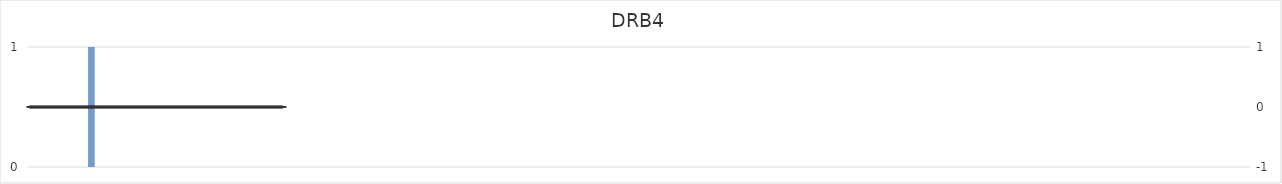
| Category | DRB4 |
|---|---|
| 1.0 | 0 |
| 2.0 | 0 |
| 3.0 | 0 |
| 4.0 | 0 |
| 5.0 | 0 |
| 6.0 | 0 |
| 7.0 | 0 |
| 8.0 | 0 |
| 9.0 | 0 |
| 10.0 | 0 |
| 11.0 | 0 |
| 12.0 | 0 |
| 13.0 | 0 |
| 14.0 | 0 |
| 15.0 | 0 |
| 16.0 | 0 |
| 17.0 | 0 |
| 18.0 | 0 |
| 19.0 | 0 |
| 20.0 | 0 |
| 21.0 | 0 |
| 22.0 | 0 |
| 23.0 | 0 |
| 24.0 | 0 |
| 25.0 | 0 |
| 26.0 | 0 |
| 27.0 | 0 |
| 28.0 | 0 |
| 29.0 | 0 |
| 30.0 | 0 |
| 31.0 | 0 |
| 32.0 | 0 |
| 33.0 | 0 |
| 34.0 | 0 |
| 35.0 | 0 |
| 36.0 | 0 |
| 37.0 | 0 |
| 38.0 | 0 |
| 39.0 | 0 |
| 40.0 | 0 |
| 41.0 | 0 |
| 42.0 | 0 |
| 43.0 | 0 |
| 44.0 | 0 |
| 45.0 | 0 |
| 46.0 | 0 |
| 47.0 | 0 |
| 48.0 | 0 |
| 49.0 | 0 |
| 50.0 | 0 |
| 51.0 | 0 |
| 52.0 | 0 |
| 53.0 | 0 |
| 54.0 | 0 |
| 55.0 | 0 |
| 56.0 | 0 |
| 57.0 | 0 |
| 58.0 | 0 |
| 59.0 | 0 |
| 60.0 | 0 |
| 61.0 | 0 |
| 62.0 | 0 |
| 63.0 | 0 |
| 64.0 | 0 |
| 65.0 | 0 |
| 66.0 | 0 |
| 67.0 | 0 |
| 68.0 | 0 |
| 69.0 | 0 |
| 70.0 | 0 |
| 71.0 | 0 |
| 72.0 | 0 |
| 73.0 | 0 |
| 74.0 | 0 |
| 75.0 | 0 |
| 76.0 | 0 |
| 77.0 | 0 |
| 78.0 | 0 |
| 79.0 | 0 |
| 80.0 | 0 |
| 81.0 | 0 |
| 82.0 | 0 |
| 83.0 | 0 |
| 84.0 | 0 |
| 85.0 | 1 |
| 86.0 | 1 |
| 87.0 | 1 |
| 88.0 | 1 |
| 89.0 | 1 |
| 90.0 | 1 |
| 91.0 | 1 |
| 92.0 | 1 |
| 93.0 | 1 |
| 94.0 | 0 |
| 95.0 | 0 |
| 96.0 | 0 |
| 97.0 | 0 |
| 98.0 | 0 |
| 99.0 | 0 |
| 100.0 | 0 |
| 101.0 | 0 |
| 102.0 | 0 |
| 103.0 | 0 |
| 104.0 | 0 |
| 105.0 | 0 |
| 106.0 | 0 |
| 107.0 | 0 |
| 108.0 | 0 |
| 109.0 | 0 |
| 110.0 | 0 |
| 111.0 | 0 |
| 112.0 | 0 |
| 113.0 | 0 |
| 114.0 | 0 |
| 115.0 | 0 |
| 116.0 | 0 |
| 117.0 | 0 |
| 118.0 | 0 |
| 119.0 | 0 |
| 120.0 | 0 |
| 121.0 | 0 |
| 122.0 | 0 |
| 123.0 | 0 |
| 124.0 | 0 |
| 125.0 | 0 |
| 126.0 | 0 |
| 127.0 | 0 |
| 128.0 | 0 |
| 129.0 | 0 |
| 130.0 | 0 |
| 131.0 | 0 |
| 132.0 | 0 |
| 133.0 | 0 |
| 134.0 | 0 |
| 135.0 | 0 |
| 136.0 | 0 |
| 137.0 | 0 |
| 138.0 | 0 |
| 139.0 | 0 |
| 140.0 | 0 |
| 141.0 | 0 |
| 142.0 | 0 |
| 143.0 | 0 |
| 144.0 | 0 |
| 145.0 | 0 |
| 146.0 | 0 |
| 147.0 | 0 |
| 148.0 | 0 |
| 149.0 | 0 |
| 150.0 | 0 |
| 151.0 | 0 |
| 152.0 | 0 |
| 153.0 | 0 |
| 154.0 | 0 |
| 155.0 | 0 |
| 156.0 | 0 |
| 157.0 | 0 |
| 158.0 | 0 |
| 159.0 | 0 |
| 160.0 | 0 |
| 161.0 | 0 |
| 162.0 | 0 |
| 163.0 | 0 |
| 164.0 | 0 |
| 165.0 | 0 |
| 166.0 | 0 |
| 167.0 | 0 |
| 168.0 | 0 |
| 169.0 | 0 |
| 170.0 | 0 |
| 171.0 | 0 |
| 172.0 | 0 |
| 173.0 | 0 |
| 174.0 | 0 |
| 175.0 | 0 |
| 176.0 | 0 |
| 177.0 | 0 |
| 178.0 | 0 |
| 179.0 | 0 |
| 180.0 | 0 |
| 181.0 | 0 |
| 182.0 | 0 |
| 183.0 | 0 |
| 184.0 | 0 |
| 185.0 | 0 |
| 186.0 | 0 |
| 187.0 | 0 |
| 188.0 | 0 |
| 189.0 | 0 |
| 190.0 | 0 |
| 191.0 | 0 |
| 192.0 | 0 |
| 193.0 | 0 |
| 194.0 | 0 |
| 195.0 | 0 |
| 196.0 | 0 |
| 197.0 | 0 |
| 198.0 | 0 |
| 199.0 | 0 |
| 200.0 | 0 |
| 201.0 | 0 |
| 202.0 | 0 |
| 203.0 | 0 |
| 204.0 | 0 |
| 205.0 | 0 |
| 206.0 | 0 |
| 207.0 | 0 |
| 208.0 | 0 |
| 209.0 | 0 |
| 210.0 | 0 |
| 211.0 | 0 |
| 212.0 | 0 |
| 213.0 | 0 |
| 214.0 | 0 |
| 215.0 | 0 |
| 216.0 | 0 |
| 217.0 | 0 |
| 218.0 | 0 |
| 219.0 | 0 |
| 220.0 | 0 |
| 221.0 | 0 |
| 222.0 | 0 |
| 223.0 | 0 |
| 224.0 | 0 |
| 225.0 | 0 |
| 226.0 | 0 |
| 227.0 | 0 |
| 228.0 | 0 |
| 229.0 | 0 |
| 230.0 | 0 |
| 231.0 | 0 |
| 232.0 | 0 |
| 233.0 | 0 |
| 234.0 | 0 |
| 235.0 | 0 |
| 236.0 | 0 |
| 237.0 | 0 |
| 238.0 | 0 |
| 239.0 | 0 |
| 240.0 | 0 |
| 241.0 | 0 |
| 242.0 | 0 |
| 243.0 | 0 |
| 244.0 | 0 |
| 245.0 | 0 |
| 246.0 | 0 |
| 247.0 | 0 |
| 248.0 | 0 |
| 249.0 | 0 |
| 250.0 | 0 |
| 251.0 | 0 |
| 252.0 | 0 |
| 253.0 | 0 |
| 254.0 | 0 |
| 255.0 | 0 |
| 256.0 | 0 |
| 257.0 | 0 |
| 258.0 | 0 |
| 259.0 | 0 |
| 260.0 | 0 |
| 261.0 | 0 |
| 262.0 | 0 |
| 263.0 | 0 |
| 264.0 | 0 |
| 265.0 | 0 |
| 266.0 | 0 |
| 267.0 | 0 |
| 268.0 | 0 |
| 269.0 | 0 |
| 270.0 | 0 |
| 271.0 | 0 |
| 272.0 | 0 |
| 273.0 | 0 |
| 274.0 | 0 |
| 275.0 | 0 |
| 276.0 | 0 |
| 277.0 | 0 |
| 278.0 | 0 |
| 279.0 | 0 |
| 280.0 | 0 |
| 281.0 | 0 |
| 282.0 | 0 |
| 283.0 | 0 |
| 284.0 | 0 |
| 285.0 | 0 |
| 286.0 | 0 |
| 287.0 | 0 |
| 288.0 | 0 |
| 289.0 | 0 |
| 290.0 | 0 |
| 291.0 | 0 |
| 292.0 | 0 |
| 293.0 | 0 |
| 294.0 | 0 |
| 295.0 | 0 |
| 296.0 | 0 |
| 297.0 | 0 |
| 298.0 | 0 |
| 299.0 | 0 |
| 300.0 | 0 |
| 301.0 | 0 |
| 302.0 | 0 |
| 303.0 | 0 |
| 304.0 | 0 |
| 305.0 | 0 |
| 306.0 | 0 |
| 307.0 | 0 |
| 308.0 | 0 |
| 309.0 | 0 |
| 310.0 | 0 |
| 311.0 | 0 |
| 312.0 | 0 |
| 313.0 | 0 |
| 314.0 | 0 |
| 315.0 | 0 |
| 316.0 | 0 |
| 317.0 | 0 |
| 318.0 | 0 |
| 319.0 | 0 |
| 320.0 | 0 |
| 321.0 | 0 |
| 322.0 | 0 |
| 323.0 | 0 |
| 324.0 | 0 |
| 325.0 | 0 |
| 326.0 | 0 |
| 327.0 | 0 |
| 328.0 | 0 |
| 329.0 | 0 |
| 330.0 | 0 |
| 331.0 | 0 |
| 332.0 | 0 |
| 333.0 | 0 |
| 334.0 | 0 |
| 335.0 | 0 |
| 336.0 | 0 |
| 337.0 | 0 |
| 338.0 | 0 |
| 339.0 | 0 |
| 340.0 | 0 |
| 341.0 | 0 |
| 342.0 | 0 |
| 343.0 | 0 |
| 344.0 | 0 |
| 345.0 | 0 |
| 346.0 | 0 |
| 347.0 | 0 |
| 348.0 | 0 |
| 349.0 | 0 |
| 350.0 | 0 |
| 351.0 | 0 |
| 352.0 | 0 |
| 353.0 | 0 |
| 354.0 | 0 |
| 355.0 | 0 |
| 356.0 | 0 |
| 357.0 | 0 |
| 358.0 | 0 |
| 359.0 | 0 |
| 360.0 | 0 |
| 361.0 | 0 |
| 362.0 | 0 |
| 363.0 | 0 |
| 364.0 | 0 |
| 365.0 | 0 |
| 366.0 | 0 |
| 367.0 | 0 |
| 368.0 | 0 |
| 369.0 | 0 |
| 370.0 | 0 |
| 371.0 | 0 |
| 372.0 | 0 |
| 373.0 | 0 |
| 374.0 | 0 |
| 375.0 | 0 |
| 376.0 | 0 |
| 377.0 | 0 |
| 378.0 | 0 |
| 379.0 | 0 |
| 380.0 | 0 |
| 381.0 | 0 |
| 382.0 | 0 |
| 383.0 | 0 |
| 384.0 | 0 |
| 385.0 | 0 |
| 386.0 | 0 |
| 387.0 | 0 |
| 388.0 | 0 |
| 389.0 | 0 |
| 390.0 | 0 |
| 391.0 | 0 |
| 392.0 | 0 |
| 393.0 | 0 |
| 394.0 | 0 |
| 395.0 | 0 |
| 396.0 | 0 |
| 397.0 | 0 |
| 398.0 | 0 |
| 399.0 | 0 |
| 400.0 | 0 |
| 401.0 | 0 |
| 402.0 | 0 |
| 403.0 | 0 |
| 404.0 | 0 |
| 405.0 | 0 |
| 406.0 | 0 |
| 407.0 | 0 |
| 408.0 | 0 |
| 409.0 | 0 |
| 410.0 | 0 |
| 411.0 | 0 |
| 412.0 | 0 |
| 413.0 | 0 |
| 414.0 | 0 |
| 415.0 | 0 |
| 416.0 | 0 |
| 417.0 | 0 |
| 418.0 | 0 |
| 419.0 | 0 |
| 420.0 | 0 |
| 421.0 | 0 |
| 422.0 | 0 |
| 423.0 | 0 |
| 424.0 | 0 |
| 425.0 | 0 |
| 426.0 | 0 |
| 427.0 | 0 |
| 428.0 | 0 |
| 429.0 | 0 |
| 430.0 | 0 |
| 431.0 | 0 |
| 432.0 | 0 |
| 433.0 | 0 |
| 434.0 | 0 |
| 435.0 | 0 |
| 436.0 | 0 |
| 437.0 | 0 |
| 438.0 | 0 |
| 439.0 | 0 |
| 440.0 | 0 |
| 441.0 | 0 |
| 442.0 | 0 |
| 443.0 | 0 |
| 444.0 | 0 |
| 445.0 | 0 |
| 446.0 | 0 |
| 447.0 | 0 |
| 448.0 | 0 |
| 449.0 | 0 |
| 450.0 | 0 |
| 451.0 | 0 |
| 452.0 | 0 |
| 453.0 | 0 |
| 454.0 | 0 |
| 455.0 | 0 |
| 456.0 | 0 |
| 457.0 | 0 |
| 458.0 | 0 |
| 459.0 | 0 |
| 460.0 | 0 |
| 461.0 | 0 |
| 462.0 | 0 |
| 463.0 | 0 |
| 464.0 | 0 |
| 465.0 | 0 |
| 466.0 | 0 |
| 467.0 | 0 |
| 468.0 | 0 |
| 469.0 | 0 |
| 470.0 | 0 |
| 471.0 | 0 |
| 472.0 | 0 |
| 473.0 | 0 |
| 474.0 | 0 |
| 475.0 | 0 |
| 476.0 | 0 |
| 477.0 | 0 |
| 478.0 | 0 |
| 479.0 | 0 |
| 480.0 | 0 |
| 481.0 | 0 |
| 482.0 | 0 |
| 483.0 | 0 |
| 484.0 | 0 |
| 485.0 | 0 |
| 486.0 | 0 |
| 487.0 | 0 |
| 488.0 | 0 |
| 489.0 | 0 |
| 490.0 | 0 |
| 491.0 | 0 |
| 492.0 | 0 |
| 493.0 | 0 |
| 494.0 | 0 |
| 495.0 | 0 |
| 496.0 | 0 |
| 497.0 | 0 |
| 498.0 | 0 |
| 499.0 | 0 |
| 500.0 | 0 |
| 501.0 | 0 |
| 502.0 | 0 |
| 503.0 | 0 |
| 504.0 | 0 |
| 505.0 | 0 |
| 506.0 | 0 |
| 507.0 | 0 |
| 508.0 | 0 |
| 509.0 | 0 |
| 510.0 | 0 |
| 511.0 | 0 |
| 512.0 | 0 |
| 513.0 | 0 |
| 514.0 | 0 |
| 515.0 | 0 |
| 516.0 | 0 |
| 517.0 | 0 |
| 518.0 | 0 |
| 519.0 | 0 |
| 520.0 | 0 |
| 521.0 | 0 |
| 522.0 | 0 |
| 523.0 | 0 |
| 524.0 | 0 |
| 525.0 | 0 |
| 526.0 | 0 |
| 527.0 | 0 |
| 528.0 | 0 |
| 529.0 | 0 |
| 530.0 | 0 |
| 531.0 | 0 |
| 532.0 | 0 |
| 533.0 | 0 |
| 534.0 | 0 |
| 535.0 | 0 |
| 536.0 | 0 |
| 537.0 | 0 |
| 538.0 | 0 |
| 539.0 | 0 |
| 540.0 | 0 |
| 541.0 | 0 |
| 542.0 | 0 |
| 543.0 | 0 |
| 544.0 | 0 |
| 545.0 | 0 |
| 546.0 | 0 |
| 547.0 | 0 |
| 548.0 | 0 |
| 549.0 | 0 |
| 550.0 | 0 |
| 551.0 | 0 |
| 552.0 | 0 |
| 553.0 | 0 |
| 554.0 | 0 |
| 555.0 | 0 |
| 556.0 | 0 |
| 557.0 | 0 |
| 558.0 | 0 |
| 559.0 | 0 |
| 560.0 | 0 |
| 561.0 | 0 |
| 562.0 | 0 |
| 563.0 | 0 |
| 564.0 | 0 |
| 565.0 | 0 |
| 566.0 | 0 |
| 567.0 | 0 |
| 568.0 | 0 |
| 569.0 | 0 |
| 570.0 | 0 |
| 571.0 | 0 |
| 572.0 | 0 |
| 573.0 | 0 |
| 574.0 | 0 |
| 575.0 | 0 |
| 576.0 | 0 |
| 577.0 | 0 |
| 578.0 | 0 |
| 579.0 | 0 |
| 580.0 | 0 |
| 581.0 | 0 |
| 582.0 | 0 |
| 583.0 | 0 |
| 584.0 | 0 |
| 585.0 | 0 |
| 586.0 | 0 |
| 587.0 | 0 |
| 588.0 | 0 |
| 589.0 | 0 |
| 590.0 | 0 |
| 591.0 | 0 |
| 592.0 | 0 |
| 593.0 | 0 |
| 594.0 | 0 |
| 595.0 | 0 |
| 596.0 | 0 |
| 597.0 | 0 |
| 598.0 | 0 |
| 599.0 | 0 |
| 600.0 | 0 |
| 601.0 | 0 |
| 602.0 | 0 |
| 603.0 | 0 |
| 604.0 | 0 |
| 605.0 | 0 |
| 606.0 | 0 |
| 607.0 | 0 |
| 608.0 | 0 |
| 609.0 | 0 |
| 610.0 | 0 |
| 611.0 | 0 |
| 612.0 | 0 |
| 613.0 | 0 |
| 614.0 | 0 |
| 615.0 | 0 |
| 616.0 | 0 |
| 617.0 | 0 |
| 618.0 | 0 |
| 619.0 | 0 |
| 620.0 | 0 |
| 621.0 | 0 |
| 622.0 | 0 |
| 623.0 | 0 |
| 624.0 | 0 |
| 625.0 | 0 |
| 626.0 | 0 |
| 627.0 | 0 |
| 628.0 | 0 |
| 629.0 | 0 |
| 630.0 | 0 |
| 631.0 | 0 |
| 632.0 | 0 |
| 633.0 | 0 |
| 634.0 | 0 |
| 635.0 | 0 |
| 636.0 | 0 |
| 637.0 | 0 |
| 638.0 | 0 |
| 639.0 | 0 |
| 640.0 | 0 |
| 641.0 | 0 |
| 642.0 | 0 |
| 643.0 | 0 |
| 644.0 | 0 |
| 645.0 | 0 |
| 646.0 | 0 |
| 647.0 | 0 |
| 648.0 | 0 |
| 649.0 | 0 |
| 650.0 | 0 |
| 651.0 | 0 |
| 652.0 | 0 |
| 653.0 | 0 |
| 654.0 | 0 |
| 655.0 | 0 |
| 656.0 | 0 |
| 657.0 | 0 |
| 658.0 | 0 |
| 659.0 | 0 |
| 660.0 | 0 |
| 661.0 | 0 |
| 662.0 | 0 |
| 663.0 | 0 |
| 664.0 | 0 |
| 665.0 | 0 |
| 666.0 | 0 |
| 667.0 | 0 |
| 668.0 | 0 |
| 669.0 | 0 |
| 670.0 | 0 |
| 671.0 | 0 |
| 672.0 | 0 |
| 673.0 | 0 |
| 674.0 | 0 |
| 675.0 | 0 |
| 676.0 | 0 |
| 677.0 | 0 |
| 678.0 | 0 |
| 679.0 | 0 |
| 680.0 | 0 |
| 681.0 | 0 |
| 682.0 | 0 |
| 683.0 | 0 |
| 684.0 | 0 |
| 685.0 | 0 |
| 686.0 | 0 |
| 687.0 | 0 |
| 688.0 | 0 |
| 689.0 | 0 |
| 690.0 | 0 |
| 691.0 | 0 |
| 692.0 | 0 |
| 693.0 | 0 |
| 694.0 | 0 |
| 695.0 | 0 |
| 696.0 | 0 |
| 697.0 | 0 |
| 698.0 | 0 |
| 699.0 | 0 |
| 700.0 | 0 |
| 701.0 | 0 |
| 702.0 | 0 |
| 703.0 | 0 |
| 704.0 | 0 |
| 705.0 | 0 |
| 706.0 | 0 |
| 707.0 | 0 |
| 708.0 | 0 |
| 709.0 | 0 |
| 710.0 | 0 |
| 711.0 | 0 |
| 712.0 | 0 |
| 713.0 | 0 |
| 714.0 | 0 |
| 715.0 | 0 |
| 716.0 | 0 |
| 717.0 | 0 |
| 718.0 | 0 |
| 719.0 | 0 |
| 720.0 | 0 |
| 721.0 | 0 |
| 722.0 | 0 |
| 723.0 | 0 |
| 724.0 | 0 |
| 725.0 | 0 |
| 726.0 | 0 |
| 727.0 | 0 |
| 728.0 | 0 |
| 729.0 | 0 |
| 730.0 | 0 |
| 731.0 | 0 |
| 732.0 | 0 |
| 733.0 | 0 |
| 734.0 | 0 |
| 735.0 | 0 |
| 736.0 | 0 |
| 737.0 | 0 |
| 738.0 | 0 |
| 739.0 | 0 |
| 740.0 | 0 |
| 741.0 | 0 |
| 742.0 | 0 |
| 743.0 | 0 |
| 744.0 | 0 |
| 745.0 | 0 |
| 746.0 | 0 |
| 747.0 | 0 |
| 748.0 | 0 |
| 749.0 | 0 |
| 750.0 | 0 |
| 751.0 | 0 |
| 752.0 | 0 |
| 753.0 | 0 |
| 754.0 | 0 |
| 755.0 | 0 |
| 756.0 | 0 |
| 757.0 | 0 |
| 758.0 | 0 |
| 759.0 | 0 |
| 760.0 | 0 |
| 761.0 | 0 |
| 762.0 | 0 |
| 763.0 | 0 |
| 764.0 | 0 |
| 765.0 | 0 |
| 766.0 | 0 |
| 767.0 | 0 |
| 768.0 | 0 |
| 769.0 | 0 |
| 770.0 | 0 |
| 771.0 | 0 |
| 772.0 | 0 |
| 773.0 | 0 |
| 774.0 | 0 |
| 775.0 | 0 |
| 776.0 | 0 |
| 777.0 | 0 |
| 778.0 | 0 |
| 779.0 | 0 |
| 780.0 | 0 |
| 781.0 | 0 |
| 782.0 | 0 |
| 783.0 | 0 |
| 784.0 | 0 |
| 785.0 | 0 |
| 786.0 | 0 |
| 787.0 | 0 |
| 788.0 | 0 |
| 789.0 | 0 |
| 790.0 | 0 |
| 791.0 | 0 |
| 792.0 | 0 |
| 793.0 | 0 |
| 794.0 | 0 |
| 795.0 | 0 |
| 796.0 | 0 |
| 797.0 | 0 |
| 798.0 | 0 |
| 799.0 | 0 |
| 800.0 | 0 |
| 801.0 | 0 |
| 802.0 | 0 |
| 803.0 | 0 |
| 804.0 | 0 |
| 805.0 | 0 |
| 806.0 | 0 |
| 807.0 | 0 |
| 808.0 | 0 |
| 809.0 | 0 |
| 810.0 | 0 |
| 811.0 | 0 |
| 812.0 | 0 |
| 813.0 | 0 |
| 814.0 | 0 |
| 815.0 | 0 |
| 816.0 | 0 |
| 817.0 | 0 |
| 818.0 | 0 |
| 819.0 | 0 |
| 820.0 | 0 |
| 821.0 | 0 |
| 822.0 | 0 |
| 823.0 | 0 |
| 824.0 | 0 |
| 825.0 | 0 |
| 826.0 | 0 |
| 827.0 | 0 |
| 828.0 | 0 |
| 829.0 | 0 |
| 830.0 | 0 |
| 831.0 | 0 |
| 832.0 | 0 |
| 833.0 | 0 |
| 834.0 | 0 |
| 835.0 | 0 |
| 836.0 | 0 |
| 837.0 | 0 |
| 838.0 | 0 |
| 839.0 | 0 |
| 840.0 | 0 |
| 841.0 | 0 |
| 842.0 | 0 |
| 843.0 | 0 |
| 844.0 | 0 |
| 845.0 | 0 |
| 846.0 | 0 |
| 847.0 | 0 |
| 848.0 | 0 |
| 849.0 | 0 |
| 850.0 | 0 |
| 851.0 | 0 |
| 852.0 | 0 |
| 853.0 | 0 |
| 854.0 | 0 |
| 855.0 | 0 |
| 856.0 | 0 |
| 857.0 | 0 |
| 858.0 | 0 |
| 859.0 | 0 |
| 860.0 | 0 |
| 861.0 | 0 |
| 862.0 | 0 |
| 863.0 | 0 |
| 864.0 | 0 |
| 865.0 | 0 |
| 866.0 | 0 |
| 867.0 | 0 |
| 868.0 | 0 |
| 869.0 | 0 |
| 870.0 | 0 |
| 871.0 | 0 |
| 872.0 | 0 |
| 873.0 | 0 |
| 874.0 | 0 |
| 875.0 | 0 |
| 876.0 | 0 |
| 877.0 | 0 |
| 878.0 | 0 |
| 879.0 | 0 |
| 880.0 | 0 |
| 881.0 | 0 |
| 882.0 | 0 |
| 883.0 | 0 |
| 884.0 | 0 |
| 885.0 | 0 |
| 886.0 | 0 |
| 887.0 | 0 |
| 888.0 | 0 |
| 889.0 | 0 |
| 890.0 | 0 |
| 891.0 | 0 |
| 892.0 | 0 |
| 893.0 | 0 |
| 894.0 | 0 |
| 895.0 | 0 |
| 896.0 | 0 |
| 897.0 | 0 |
| 898.0 | 0 |
| 899.0 | 0 |
| 900.0 | 0 |
| 901.0 | 0 |
| 902.0 | 0 |
| 903.0 | 0 |
| 904.0 | 0 |
| 905.0 | 0 |
| 906.0 | 0 |
| 907.0 | 0 |
| 908.0 | 0 |
| 909.0 | 0 |
| 910.0 | 0 |
| 911.0 | 0 |
| 912.0 | 0 |
| 913.0 | 0 |
| 914.0 | 0 |
| 915.0 | 0 |
| 916.0 | 0 |
| 917.0 | 0 |
| 918.0 | 0 |
| 919.0 | 0 |
| 920.0 | 0 |
| 921.0 | 0 |
| 922.0 | 0 |
| 923.0 | 0 |
| 924.0 | 0 |
| 925.0 | 0 |
| 926.0 | 0 |
| 927.0 | 0 |
| 928.0 | 0 |
| 929.0 | 0 |
| 930.0 | 0 |
| 931.0 | 0 |
| 932.0 | 0 |
| 933.0 | 0 |
| 934.0 | 0 |
| 935.0 | 0 |
| 936.0 | 0 |
| 937.0 | 0 |
| 938.0 | 0 |
| 939.0 | 0 |
| 940.0 | 0 |
| 941.0 | 0 |
| 942.0 | 0 |
| 943.0 | 0 |
| 944.0 | 0 |
| 945.0 | 0 |
| 946.0 | 0 |
| 947.0 | 0 |
| 948.0 | 0 |
| 949.0 | 0 |
| 950.0 | 0 |
| 951.0 | 0 |
| 952.0 | 0 |
| 953.0 | 0 |
| 954.0 | 0 |
| 955.0 | 0 |
| 956.0 | 0 |
| 957.0 | 0 |
| 958.0 | 0 |
| 959.0 | 0 |
| 960.0 | 0 |
| 961.0 | 0 |
| 962.0 | 0 |
| 963.0 | 0 |
| 964.0 | 0 |
| 965.0 | 0 |
| 966.0 | 0 |
| 967.0 | 0 |
| 968.0 | 0 |
| 969.0 | 0 |
| 970.0 | 0 |
| 971.0 | 0 |
| 972.0 | 0 |
| 973.0 | 0 |
| 974.0 | 0 |
| 975.0 | 0 |
| 976.0 | 0 |
| 977.0 | 0 |
| 978.0 | 0 |
| 979.0 | 0 |
| 980.0 | 0 |
| 981.0 | 0 |
| 982.0 | 0 |
| 983.0 | 0 |
| 984.0 | 0 |
| 985.0 | 0 |
| 986.0 | 0 |
| 987.0 | 0 |
| 988.0 | 0 |
| 989.0 | 0 |
| 990.0 | 0 |
| 991.0 | 0 |
| 992.0 | 0 |
| 993.0 | 0 |
| 994.0 | 0 |
| 995.0 | 0 |
| 996.0 | 0 |
| 997.0 | 0 |
| 998.0 | 0 |
| 999.0 | 0 |
| 1000.0 | 0 |
| 1001.0 | 0 |
| 1002.0 | 0 |
| 1003.0 | 0 |
| 1004.0 | 0 |
| 1005.0 | 0 |
| 1006.0 | 0 |
| 1007.0 | 0 |
| 1008.0 | 0 |
| 1009.0 | 0 |
| 1010.0 | 0 |
| 1011.0 | 0 |
| 1012.0 | 0 |
| 1013.0 | 0 |
| 1014.0 | 0 |
| 1015.0 | 0 |
| 1016.0 | 0 |
| 1017.0 | 0 |
| 1018.0 | 0 |
| 1019.0 | 0 |
| 1020.0 | 0 |
| 1021.0 | 0 |
| 1022.0 | 0 |
| 1023.0 | 0 |
| 1024.0 | 0 |
| 1025.0 | 0 |
| 1026.0 | 0 |
| 1027.0 | 0 |
| 1028.0 | 0 |
| 1029.0 | 0 |
| 1030.0 | 0 |
| 1031.0 | 0 |
| 1032.0 | 0 |
| 1033.0 | 0 |
| 1034.0 | 0 |
| 1035.0 | 0 |
| 1036.0 | 0 |
| 1037.0 | 0 |
| 1038.0 | 0 |
| 1039.0 | 0 |
| 1040.0 | 0 |
| 1041.0 | 0 |
| 1042.0 | 0 |
| 1043.0 | 0 |
| 1044.0 | 0 |
| 1045.0 | 0 |
| 1046.0 | 0 |
| 1047.0 | 0 |
| 1048.0 | 0 |
| 1049.0 | 0 |
| 1050.0 | 0 |
| 1051.0 | 0 |
| 1052.0 | 0 |
| 1053.0 | 0 |
| 1054.0 | 0 |
| 1055.0 | 0 |
| 1056.0 | 0 |
| 1057.0 | 0 |
| 1058.0 | 0 |
| 1059.0 | 0 |
| 1060.0 | 0 |
| 1061.0 | 0 |
| 1062.0 | 0 |
| 1063.0 | 0 |
| 1064.0 | 0 |
| 1065.0 | 0 |
| 1066.0 | 0 |
| 1067.0 | 0 |
| 1068.0 | 0 |
| 1069.0 | 0 |
| 1070.0 | 0 |
| 1071.0 | 0 |
| 1072.0 | 0 |
| 1073.0 | 0 |
| 1074.0 | 0 |
| 1075.0 | 0 |
| 1076.0 | 0 |
| 1077.0 | 0 |
| 1078.0 | 0 |
| 1079.0 | 0 |
| 1080.0 | 0 |
| 1081.0 | 0 |
| 1082.0 | 0 |
| 1083.0 | 0 |
| 1084.0 | 0 |
| 1085.0 | 0 |
| 1086.0 | 0 |
| 1087.0 | 0 |
| 1088.0 | 0 |
| 1089.0 | 0 |
| 1090.0 | 0 |
| 1091.0 | 0 |
| 1092.0 | 0 |
| 1093.0 | 0 |
| 1094.0 | 0 |
| 1095.0 | 0 |
| 1096.0 | 0 |
| 1097.0 | 0 |
| 1098.0 | 0 |
| 1099.0 | 0 |
| 1100.0 | 0 |
| 1101.0 | 0 |
| 1102.0 | 0 |
| 1103.0 | 0 |
| 1104.0 | 0 |
| 1105.0 | 0 |
| 1106.0 | 0 |
| 1107.0 | 0 |
| 1108.0 | 0 |
| 1109.0 | 0 |
| 1110.0 | 0 |
| 1111.0 | 0 |
| 1112.0 | 0 |
| 1113.0 | 0 |
| 1114.0 | 0 |
| 1115.0 | 0 |
| 1116.0 | 0 |
| 1117.0 | 0 |
| 1118.0 | 0 |
| 1119.0 | 0 |
| 1120.0 | 0 |
| 1121.0 | 0 |
| 1122.0 | 0 |
| 1123.0 | 0 |
| 1124.0 | 0 |
| 1125.0 | 0 |
| 1126.0 | 0 |
| 1127.0 | 0 |
| 1128.0 | 0 |
| 1129.0 | 0 |
| 1130.0 | 0 |
| 1131.0 | 0 |
| 1132.0 | 0 |
| 1133.0 | 0 |
| 1134.0 | 0 |
| 1135.0 | 0 |
| 1136.0 | 0 |
| 1137.0 | 0 |
| 1138.0 | 0 |
| 1139.0 | 0 |
| 1140.0 | 0 |
| 1141.0 | 0 |
| 1142.0 | 0 |
| 1143.0 | 0 |
| 1144.0 | 0 |
| 1145.0 | 0 |
| 1146.0 | 0 |
| 1147.0 | 0 |
| 1148.0 | 0 |
| 1149.0 | 0 |
| 1150.0 | 0 |
| 1151.0 | 0 |
| 1152.0 | 0 |
| 1153.0 | 0 |
| 1154.0 | 0 |
| 1155.0 | 0 |
| 1156.0 | 0 |
| 1157.0 | 0 |
| 1158.0 | 0 |
| 1159.0 | 0 |
| 1160.0 | 0 |
| 1161.0 | 0 |
| 1162.0 | 0 |
| 1163.0 | 0 |
| 1164.0 | 0 |
| 1165.0 | 0 |
| 1166.0 | 0 |
| 1167.0 | 0 |
| 1168.0 | 0 |
| 1169.0 | 0 |
| 1170.0 | 0 |
| 1171.0 | 0 |
| 1172.0 | 0 |
| 1173.0 | 0 |
| 1174.0 | 0 |
| 1175.0 | 0 |
| 1176.0 | 0 |
| 1177.0 | 0 |
| 1178.0 | 0 |
| 1179.0 | 0 |
| 1180.0 | 0 |
| 1181.0 | 0 |
| 1182.0 | 0 |
| 1183.0 | 0 |
| 1184.0 | 0 |
| 1185.0 | 0 |
| 1186.0 | 0 |
| 1187.0 | 0 |
| 1188.0 | 0 |
| 1189.0 | 0 |
| 1190.0 | 0 |
| 1191.0 | 0 |
| 1192.0 | 0 |
| 1193.0 | 0 |
| 1194.0 | 0 |
| 1195.0 | 0 |
| 1196.0 | 0 |
| 1197.0 | 0 |
| 1198.0 | 0 |
| 1199.0 | 0 |
| 1200.0 | 0 |
| 1201.0 | 0 |
| 1202.0 | 0 |
| 1203.0 | 0 |
| 1204.0 | 0 |
| 1205.0 | 0 |
| 1206.0 | 0 |
| 1207.0 | 0 |
| 1208.0 | 0 |
| 1209.0 | 0 |
| 1210.0 | 0 |
| 1211.0 | 0 |
| 1212.0 | 0 |
| 1213.0 | 0 |
| 1214.0 | 0 |
| 1215.0 | 0 |
| 1216.0 | 0 |
| 1217.0 | 0 |
| 1218.0 | 0 |
| 1219.0 | 0 |
| 1220.0 | 0 |
| 1221.0 | 0 |
| 1222.0 | 0 |
| 1223.0 | 0 |
| 1224.0 | 0 |
| 1225.0 | 0 |
| 1226.0 | 0 |
| 1227.0 | 0 |
| 1228.0 | 0 |
| 1229.0 | 0 |
| 1230.0 | 0 |
| 1231.0 | 0 |
| 1232.0 | 0 |
| 1233.0 | 0 |
| 1234.0 | 0 |
| 1235.0 | 0 |
| 1236.0 | 0 |
| 1237.0 | 0 |
| 1238.0 | 0 |
| 1239.0 | 0 |
| 1240.0 | 0 |
| 1241.0 | 0 |
| 1242.0 | 0 |
| 1243.0 | 0 |
| 1244.0 | 0 |
| 1245.0 | 0 |
| 1246.0 | 0 |
| 1247.0 | 0 |
| 1248.0 | 0 |
| 1249.0 | 0 |
| 1250.0 | 0 |
| 1251.0 | 0 |
| 1252.0 | 0 |
| 1253.0 | 0 |
| 1254.0 | 0 |
| 1255.0 | 0 |
| 1256.0 | 0 |
| 1257.0 | 0 |
| 1258.0 | 0 |
| 1259.0 | 0 |
| 1260.0 | 0 |
| 1261.0 | 0 |
| 1262.0 | 0 |
| 1263.0 | 0 |
| 1264.0 | 0 |
| 1265.0 | 0 |
| 1266.0 | 0 |
| 1267.0 | 0 |
| 1268.0 | 0 |
| 1269.0 | 0 |
| 1270.0 | 0 |
| 1271.0 | 0 |
| 1272.0 | 0 |
| 1273.0 | 0 |
| 1274.0 | 0 |
| 1275.0 | 0 |
| 1276.0 | 0 |
| 1277.0 | 0 |
| 1278.0 | 0 |
| 1279.0 | 0 |
| 1280.0 | 0 |
| 1281.0 | 0 |
| 1282.0 | 0 |
| 1283.0 | 0 |
| 1284.0 | 0 |
| 1285.0 | 0 |
| 1286.0 | 0 |
| 1287.0 | 0 |
| 1288.0 | 0 |
| 1289.0 | 0 |
| 1290.0 | 0 |
| 1291.0 | 0 |
| 1292.0 | 0 |
| 1293.0 | 0 |
| 1294.0 | 0 |
| 1295.0 | 0 |
| 1296.0 | 0 |
| 1297.0 | 0 |
| 1298.0 | 0 |
| 1299.0 | 0 |
| 1300.0 | 0 |
| 1301.0 | 0 |
| 1302.0 | 0 |
| 1303.0 | 0 |
| 1304.0 | 0 |
| 1305.0 | 0 |
| 1306.0 | 0 |
| 1307.0 | 0 |
| 1308.0 | 0 |
| 1309.0 | 0 |
| 1310.0 | 0 |
| 1311.0 | 0 |
| 1312.0 | 0 |
| 1313.0 | 0 |
| 1314.0 | 0 |
| 1315.0 | 0 |
| 1316.0 | 0 |
| 1317.0 | 0 |
| 1318.0 | 0 |
| 1319.0 | 0 |
| 1320.0 | 0 |
| 1321.0 | 0 |
| 1322.0 | 0 |
| 1323.0 | 0 |
| 1324.0 | 0 |
| 1325.0 | 0 |
| 1326.0 | 0 |
| 1327.0 | 0 |
| 1328.0 | 0 |
| 1329.0 | 0 |
| 1330.0 | 0 |
| 1331.0 | 0 |
| 1332.0 | 0 |
| 1333.0 | 0 |
| 1334.0 | 0 |
| 1335.0 | 0 |
| 1336.0 | 0 |
| 1337.0 | 0 |
| 1338.0 | 0 |
| 1339.0 | 0 |
| 1340.0 | 0 |
| 1341.0 | 0 |
| 1342.0 | 0 |
| 1343.0 | 0 |
| 1344.0 | 0 |
| 1345.0 | 0 |
| 1346.0 | 0 |
| 1347.0 | 0 |
| 1348.0 | 0 |
| 1349.0 | 0 |
| 1350.0 | 0 |
| 1351.0 | 0 |
| 1352.0 | 0 |
| 1353.0 | 0 |
| 1354.0 | 0 |
| 1355.0 | 0 |
| 1356.0 | 0 |
| 1357.0 | 0 |
| 1358.0 | 0 |
| 1359.0 | 0 |
| 1360.0 | 0 |
| 1361.0 | 0 |
| 1362.0 | 0 |
| 1363.0 | 0 |
| 1364.0 | 0 |
| 1365.0 | 0 |
| 1366.0 | 0 |
| 1367.0 | 0 |
| 1368.0 | 0 |
| 1369.0 | 0 |
| 1370.0 | 0 |
| 1371.0 | 0 |
| 1372.0 | 0 |
| 1373.0 | 0 |
| 1374.0 | 0 |
| 1375.0 | 0 |
| 1376.0 | 0 |
| 1377.0 | 0 |
| 1378.0 | 0 |
| 1379.0 | 0 |
| 1380.0 | 0 |
| 1381.0 | 0 |
| 1382.0 | 0 |
| 1383.0 | 0 |
| 1384.0 | 0 |
| 1385.0 | 0 |
| 1386.0 | 0 |
| 1387.0 | 0 |
| 1388.0 | 0 |
| 1389.0 | 0 |
| 1390.0 | 0 |
| 1391.0 | 0 |
| 1392.0 | 0 |
| 1393.0 | 0 |
| 1394.0 | 0 |
| 1395.0 | 0 |
| 1396.0 | 0 |
| 1397.0 | 0 |
| 1398.0 | 0 |
| 1399.0 | 0 |
| 1400.0 | 0 |
| 1401.0 | 0 |
| 1402.0 | 0 |
| 1403.0 | 0 |
| 1404.0 | 0 |
| 1405.0 | 0 |
| 1406.0 | 0 |
| 1407.0 | 0 |
| 1408.0 | 0 |
| 1409.0 | 0 |
| 1410.0 | 0 |
| 1411.0 | 0 |
| 1412.0 | 0 |
| 1413.0 | 0 |
| 1414.0 | 0 |
| 1415.0 | 0 |
| 1416.0 | 0 |
| 1417.0 | 0 |
| 1418.0 | 0 |
| 1419.0 | 0 |
| 1420.0 | 0 |
| 1421.0 | 0 |
| 1422.0 | 0 |
| 1423.0 | 0 |
| 1424.0 | 0 |
| 1425.0 | 0 |
| 1426.0 | 0 |
| 1427.0 | 0 |
| 1428.0 | 0 |
| 1429.0 | 0 |
| 1430.0 | 0 |
| 1431.0 | 0 |
| 1432.0 | 0 |
| 1433.0 | 0 |
| 1434.0 | 0 |
| 1435.0 | 0 |
| 1436.0 | 0 |
| 1437.0 | 0 |
| 1438.0 | 0 |
| 1439.0 | 0 |
| 1440.0 | 0 |
| 1441.0 | 0 |
| 1442.0 | 0 |
| 1443.0 | 0 |
| 1444.0 | 0 |
| 1445.0 | 0 |
| 1446.0 | 0 |
| 1447.0 | 0 |
| 1448.0 | 0 |
| 1449.0 | 0 |
| 1450.0 | 0 |
| 1451.0 | 0 |
| 1452.0 | 0 |
| 1453.0 | 0 |
| 1454.0 | 0 |
| 1455.0 | 0 |
| 1456.0 | 0 |
| 1457.0 | 0 |
| 1458.0 | 0 |
| 1459.0 | 0 |
| 1460.0 | 0 |
| 1461.0 | 0 |
| 1462.0 | 0 |
| 1463.0 | 0 |
| 1464.0 | 0 |
| 1465.0 | 0 |
| 1466.0 | 0 |
| 1467.0 | 0 |
| 1468.0 | 0 |
| 1469.0 | 0 |
| 1470.0 | 0 |
| 1471.0 | 0 |
| 1472.0 | 0 |
| 1473.0 | 0 |
| 1474.0 | 0 |
| 1475.0 | 0 |
| 1476.0 | 0 |
| 1477.0 | 0 |
| 1478.0 | 0 |
| 1479.0 | 0 |
| 1480.0 | 0 |
| 1481.0 | 0 |
| 1482.0 | 0 |
| 1483.0 | 0 |
| 1484.0 | 0 |
| 1485.0 | 0 |
| 1486.0 | 0 |
| 1487.0 | 0 |
| 1488.0 | 0 |
| 1489.0 | 0 |
| 1490.0 | 0 |
| 1491.0 | 0 |
| 1492.0 | 0 |
| 1493.0 | 0 |
| 1494.0 | 0 |
| 1495.0 | 0 |
| 1496.0 | 0 |
| 1497.0 | 0 |
| 1498.0 | 0 |
| 1499.0 | 0 |
| 1500.0 | 0 |
| 1501.0 | 0 |
| 1502.0 | 0 |
| 1503.0 | 0 |
| 1504.0 | 0 |
| 1505.0 | 0 |
| 1506.0 | 0 |
| 1507.0 | 0 |
| 1508.0 | 0 |
| 1509.0 | 0 |
| 1510.0 | 0 |
| 1511.0 | 0 |
| 1512.0 | 0 |
| 1513.0 | 0 |
| 1514.0 | 0 |
| 1515.0 | 0 |
| 1516.0 | 0 |
| 1517.0 | 0 |
| 1518.0 | 0 |
| 1519.0 | 0 |
| 1520.0 | 0 |
| 1521.0 | 0 |
| 1522.0 | 0 |
| 1523.0 | 0 |
| 1524.0 | 0 |
| 1525.0 | 0 |
| 1526.0 | 0 |
| 1527.0 | 0 |
| 1528.0 | 0 |
| 1529.0 | 0 |
| 1530.0 | 0 |
| 1531.0 | 0 |
| 1532.0 | 0 |
| 1533.0 | 0 |
| 1534.0 | 0 |
| 1535.0 | 0 |
| 1536.0 | 0 |
| 1537.0 | 0 |
| 1538.0 | 0 |
| 1539.0 | 0 |
| 1540.0 | 0 |
| 1541.0 | 0 |
| 1542.0 | 0 |
| 1543.0 | 0 |
| 1544.0 | 0 |
| 1545.0 | 0 |
| 1546.0 | 0 |
| 1547.0 | 0 |
| 1548.0 | 0 |
| 1549.0 | 0 |
| 1550.0 | 0 |
| 1551.0 | 0 |
| 1552.0 | 0 |
| 1553.0 | 0 |
| 1554.0 | 0 |
| 1555.0 | 0 |
| 1556.0 | 0 |
| 1557.0 | 0 |
| 1558.0 | 0 |
| 1559.0 | 0 |
| 1560.0 | 0 |
| 1561.0 | 0 |
| 1562.0 | 0 |
| 1563.0 | 0 |
| 1564.0 | 0 |
| 1565.0 | 0 |
| 1566.0 | 0 |
| 1567.0 | 0 |
| 1568.0 | 0 |
| 1569.0 | 0 |
| 1570.0 | 0 |
| 1571.0 | 0 |
| 1572.0 | 0 |
| 1573.0 | 0 |
| 1574.0 | 0 |
| 1575.0 | 0 |
| 1576.0 | 0 |
| 1577.0 | 0 |
| 1578.0 | 0 |
| 1579.0 | 0 |
| 1580.0 | 0 |
| 1581.0 | 0 |
| 1582.0 | 0 |
| 1583.0 | 0 |
| 1584.0 | 0 |
| 1585.0 | 0 |
| 1586.0 | 0 |
| 1587.0 | 0 |
| 1588.0 | 0 |
| 1589.0 | 0 |
| 1590.0 | 0 |
| 1591.0 | 0 |
| 1592.0 | 0 |
| 1593.0 | 0 |
| 1594.0 | 0 |
| 1595.0 | 0 |
| 1596.0 | 0 |
| 1597.0 | 0 |
| 1598.0 | 0 |
| 1599.0 | 0 |
| 1600.0 | 0 |
| 1601.0 | 0 |
| 1602.0 | 0 |
| 1603.0 | 0 |
| 1604.0 | 0 |
| 1605.0 | 0 |
| 1606.0 | 0 |
| 1607.0 | 0 |
| 1608.0 | 0 |
| 1609.0 | 0 |
| 1610.0 | 0 |
| 1611.0 | 0 |
| 1612.0 | 0 |
| 1613.0 | 0 |
| 1614.0 | 0 |
| 1615.0 | 0 |
| 1616.0 | 0 |
| 1617.0 | 0 |
| 1618.0 | 0 |
| 1619.0 | 0 |
| 1620.0 | 0 |
| 1621.0 | 0 |
| 1622.0 | 0 |
| 1623.0 | 0 |
| 1624.0 | 0 |
| 1625.0 | 0 |
| 1626.0 | 0 |
| 1627.0 | 0 |
| 1628.0 | 0 |
| 1629.0 | 0 |
| 1630.0 | 0 |
| 1631.0 | 0 |
| 1632.0 | 0 |
| 1633.0 | 0 |
| 1634.0 | 0 |
| 1635.0 | 0 |
| 1636.0 | 0 |
| 1637.0 | 0 |
| 1638.0 | 0 |
| 1639.0 | 0 |
| 1640.0 | 0 |
| 1641.0 | 0 |
| 1642.0 | 0 |
| 1643.0 | 0 |
| 1644.0 | 0 |
| 1645.0 | 0 |
| 1646.0 | 0 |
| 1647.0 | 0 |
| 1648.0 | 0 |
| 1649.0 | 0 |
| 1650.0 | 0 |
| 1651.0 | 0 |
| 1652.0 | 0 |
| 1653.0 | 0 |
| 1654.0 | 0 |
| 1655.0 | 0 |
| 1656.0 | 0 |
| 1657.0 | 0 |
| 1658.0 | 0 |
| 1659.0 | 0 |
| 1660.0 | 0 |
| 1661.0 | 0 |
| 1662.0 | 0 |
| 1663.0 | 0 |
| 1664.0 | 0 |
| 1665.0 | 0 |
| 1666.0 | 0 |
| 1667.0 | 0 |
| 1668.0 | 0 |
| 1669.0 | 0 |
| 1670.0 | 0 |
| 1671.0 | 0 |
| 1672.0 | 0 |
| 1673.0 | 0 |
| 1674.0 | 0 |
| 1675.0 | 0 |
| 1676.0 | 0 |
| 1677.0 | 0 |
| 1678.0 | 0 |
| 1679.0 | 0 |
| 1680.0 | 0 |
| 1681.0 | 0 |
| 1682.0 | 0 |
| 1683.0 | 0 |
| 1684.0 | 0 |
| 1685.0 | 0 |
| 1686.0 | 0 |
| 1687.0 | 0 |
| 1688.0 | 0 |
| 1689.0 | 0 |
| 1690.0 | 0 |
| 1691.0 | 0 |
| 1692.0 | 0 |
| 1693.0 | 0 |
| 1694.0 | 0 |
| 1695.0 | 0 |
| 1696.0 | 0 |
| 1697.0 | 0 |
| 1698.0 | 0 |
| 1699.0 | 0 |
| 1700.0 | 0 |
| 1701.0 | 0 |
| 1702.0 | 0 |
| 1703.0 | 0 |
| 1704.0 | 0 |
| 1705.0 | 0 |
| 1706.0 | 0 |
| 1707.0 | 0 |